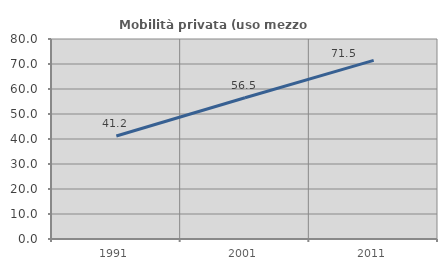
| Category | Mobilità privata (uso mezzo privato) |
|---|---|
| 1991.0 | 41.223 |
| 2001.0 | 56.506 |
| 2011.0 | 71.467 |